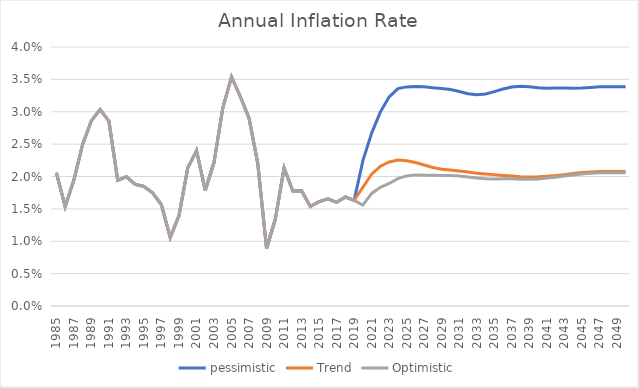
| Category | pessimistic | Trend | Optimistic |
|---|---|---|---|
| 1985.0 | 0.021 | 0.021 | 0.021 |
| 1986.0 | 0.015 | 0.015 | 0.015 |
| 1987.0 | 0.019 | 0.019 | 0.019 |
| 1988.0 | 0.025 | 0.025 | 0.025 |
| 1989.0 | 0.029 | 0.029 | 0.029 |
| 1990.0 | 0.03 | 0.03 | 0.03 |
| 1991.0 | 0.029 | 0.029 | 0.029 |
| 1992.0 | 0.019 | 0.019 | 0.019 |
| 1993.0 | 0.02 | 0.02 | 0.02 |
| 1994.0 | 0.019 | 0.019 | 0.019 |
| 1995.0 | 0.018 | 0.018 | 0.018 |
| 1996.0 | 0.017 | 0.017 | 0.017 |
| 1997.0 | 0.016 | 0.016 | 0.016 |
| 1998.0 | 0.011 | 0.011 | 0.011 |
| 1999.0 | 0.014 | 0.014 | 0.014 |
| 2000.0 | 0.021 | 0.021 | 0.021 |
| 2001.0 | 0.024 | 0.024 | 0.024 |
| 2002.0 | 0.018 | 0.018 | 0.018 |
| 2003.0 | 0.022 | 0.022 | 0.022 |
| 2004.0 | 0.031 | 0.031 | 0.031 |
| 2005.0 | 0.035 | 0.035 | 0.035 |
| 2006.0 | 0.032 | 0.032 | 0.032 |
| 2007.0 | 0.029 | 0.029 | 0.029 |
| 2008.0 | 0.022 | 0.022 | 0.022 |
| 2009.0 | 0.009 | 0.009 | 0.009 |
| 2010.0 | 0.013 | 0.013 | 0.013 |
| 2011.0 | 0.021 | 0.021 | 0.021 |
| 2012.0 | 0.018 | 0.018 | 0.018 |
| 2013.0 | 0.018 | 0.018 | 0.018 |
| 2014.0 | 0.015 | 0.015 | 0.015 |
| 2015.0 | 0.016 | 0.016 | 0.016 |
| 2016.0 | 0.017 | 0.017 | 0.017 |
| 2017.0 | 0.016 | 0.016 | 0.016 |
| 2018.0 | 0.017 | 0.017 | 0.017 |
| 2019.0 | 0.016 | 0.016 | 0.016 |
| 2020.0 | 0.022 | 0.018 | 0.016 |
| 2021.0 | 0.027 | 0.02 | 0.017 |
| 2022.0 | 0.03 | 0.022 | 0.018 |
| 2023.0 | 0.032 | 0.022 | 0.019 |
| 2024.0 | 0.034 | 0.023 | 0.02 |
| 2025.0 | 0.034 | 0.022 | 0.02 |
| 2026.0 | 0.034 | 0.022 | 0.02 |
| 2027.0 | 0.034 | 0.022 | 0.02 |
| 2028.0 | 0.034 | 0.021 | 0.02 |
| 2029.0 | 0.034 | 0.021 | 0.02 |
| 2030.0 | 0.033 | 0.021 | 0.02 |
| 2031.0 | 0.033 | 0.021 | 0.02 |
| 2032.0 | 0.033 | 0.021 | 0.02 |
| 2033.0 | 0.033 | 0.021 | 0.02 |
| 2034.0 | 0.033 | 0.02 | 0.02 |
| 2035.0 | 0.033 | 0.02 | 0.02 |
| 2036.0 | 0.034 | 0.02 | 0.02 |
| 2037.0 | 0.034 | 0.02 | 0.02 |
| 2038.0 | 0.034 | 0.02 | 0.02 |
| 2039.0 | 0.034 | 0.02 | 0.02 |
| 2040.0 | 0.034 | 0.02 | 0.02 |
| 2041.0 | 0.034 | 0.02 | 0.02 |
| 2042.0 | 0.034 | 0.02 | 0.02 |
| 2043.0 | 0.034 | 0.02 | 0.02 |
| 2044.0 | 0.034 | 0.02 | 0.02 |
| 2045.0 | 0.034 | 0.021 | 0.02 |
| 2046.0 | 0.034 | 0.021 | 0.021 |
| 2047.0 | 0.034 | 0.021 | 0.021 |
| 2048.0 | 0.034 | 0.021 | 0.021 |
| 2049.0 | 0.034 | 0.021 | 0.021 |
| 2050.0 | 0.034 | 0.021 | 0.021 |